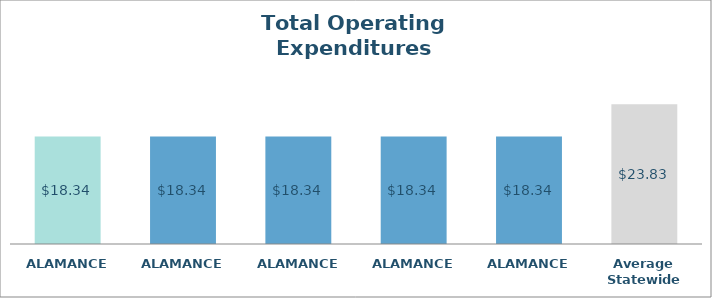
| Category | Series 0 |
|---|---|
| ALAMANCE  | 18.345 |
| ALAMANCE  | 18.345 |
| ALAMANCE  | 18.345 |
| ALAMANCE  | 18.345 |
| ALAMANCE  | 18.345 |
| Average Statewide | 23.833 |